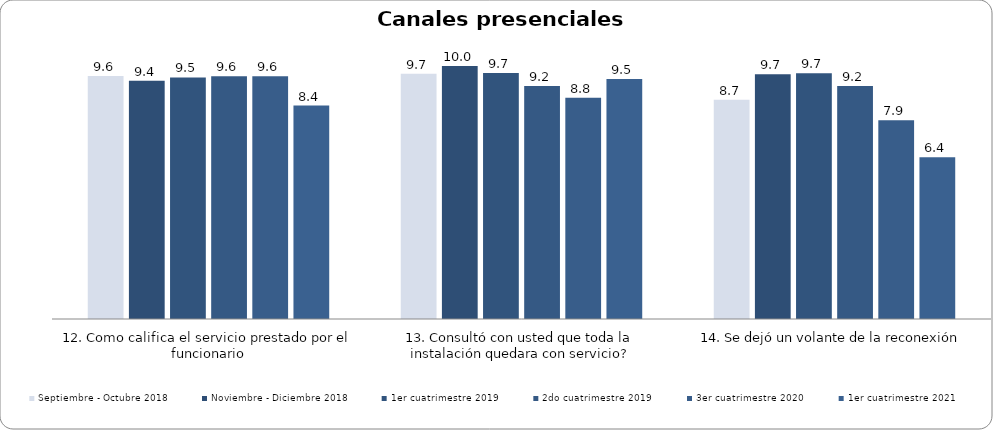
| Category | Septiembre - Octubre 2018 | Noviembre - Diciembre 2018 | 1er cuatrimestre 2019 | 2do cuatrimestre 2019 | 3er cuatrimestre 2020 | 1er cuatrimestre 2021 |
|---|---|---|---|---|---|---|
| 12. Como califica el servicio prestado por el funcionario | 9.606 | 9.419 | 9.548 | 9.596 | 9.596 | 8.435 |
| 13. Consultó con usted que toda la instalación quedara con servicio? | 9.697 | 10 | 9.726 | 9.213 | 8.75 | 9.483 |
| 14. Se dejó un volante de la reconexión | 8.667 | 9.677 | 9.718 | 9.211 | 7.857 | 6.393 |